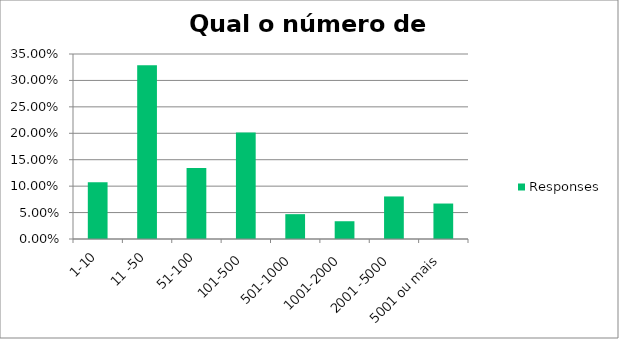
| Category | Responses |
|---|---|
| 1-10 | 0.107 |
| 11 -50 | 0.329 |
| 51-100 | 0.134 |
| 101-500 | 0.201 |
| 501-1000 | 0.047 |
| 1001-2000 | 0.034 |
| 2001 -5000 | 0.08 |
| 5001 ou mais | 0.067 |